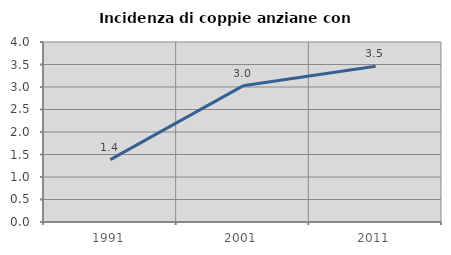
| Category | Incidenza di coppie anziane con figli |
|---|---|
| 1991.0 | 1.387 |
| 2001.0 | 3.025 |
| 2011.0 | 3.46 |